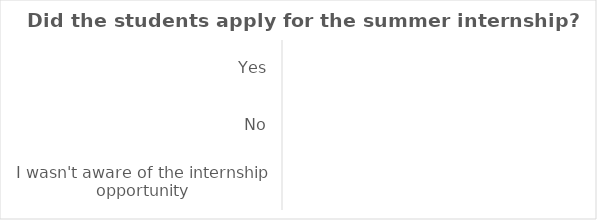
| Category | Series 0 |
|---|---|
| Yes | 0 |
| No | 0 |
| I wasn't aware of the internship opportunity | 0 |